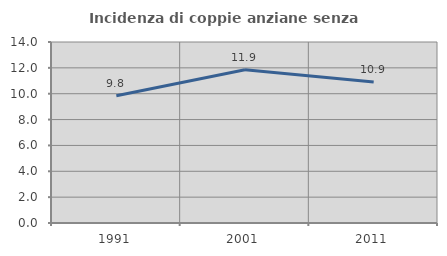
| Category | Incidenza di coppie anziane senza figli  |
|---|---|
| 1991.0 | 9.847 |
| 2001.0 | 11.855 |
| 2011.0 | 10.897 |